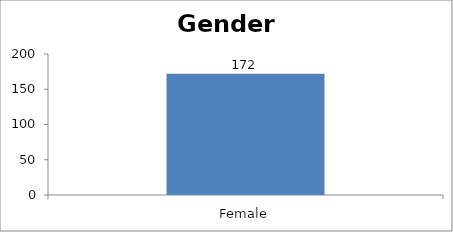
| Category | Gender |
|---|---|
| Female | 172 |